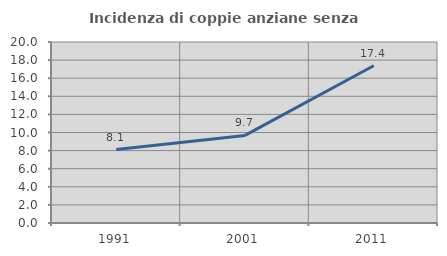
| Category | Incidenza di coppie anziane senza figli  |
|---|---|
| 1991.0 | 8.12 |
| 2001.0 | 9.677 |
| 2011.0 | 17.379 |